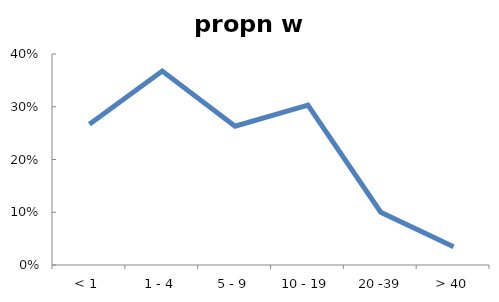
| Category | propn w fever |
|---|---|
| < 1 | 0.267 |
| 1 - 4 | 0.368 |
| 5 - 9 | 0.263 |
| 10 - 19 | 0.303 |
|  20 -39 | 0.1 |
| > 40 | 0.034 |